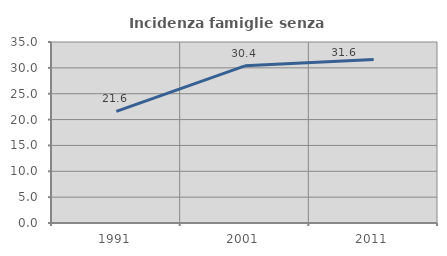
| Category | Incidenza famiglie senza nuclei |
|---|---|
| 1991.0 | 21.579 |
| 2001.0 | 30.386 |
| 2011.0 | 31.621 |